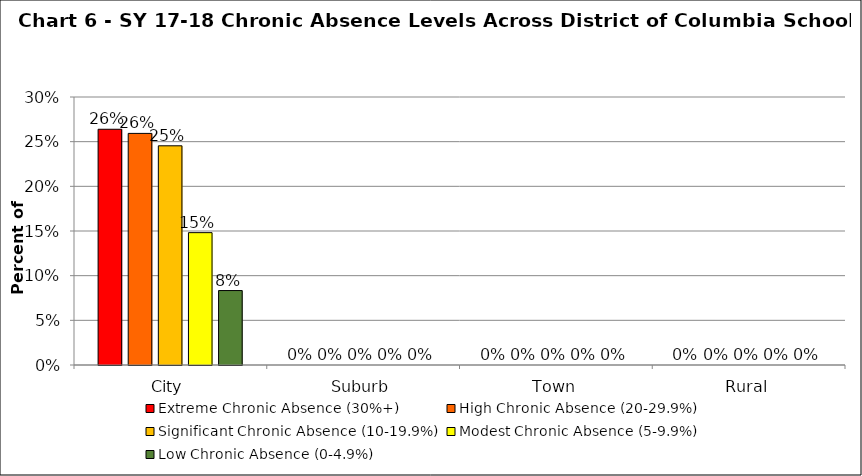
| Category | Extreme Chronic Absence (30%+) | High Chronic Absence (20-29.9%) | Significant Chronic Absence (10-19.9%) | Modest Chronic Absence (5-9.9%) | Low Chronic Absence (0-4.9%) |
|---|---|---|---|---|---|
| 0 | 0.264 | 0.259 | 0.245 | 0.148 | 0.083 |
| 1 | 0 | 0 | 0 | 0 | 0 |
| 2 | 0 | 0 | 0 | 0 | 0 |
| 3 | 0 | 0 | 0 | 0 | 0 |